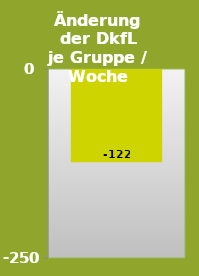
| Category | Series 0 |
|---|---|
| 0 | -122.074 |